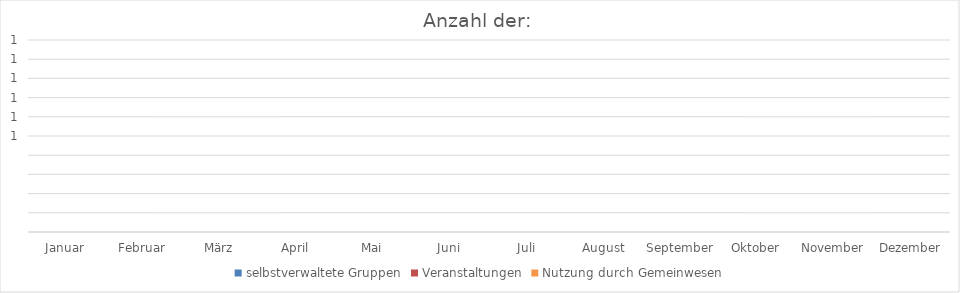
| Category | selbstverwaltete Gruppen | Veranstaltungen | Nutzung durch Gemeinwesen |
|---|---|---|---|
| Januar | 0 | 0 | 0 |
| Februar | 0 | 0 | 0 |
| März | 0 | 0 | 0 |
| April | 0 | 0 | 0 |
| Mai | 0 | 0 | 0 |
| Juni | 0 | 0 | 0 |
| Juli | 0 | 0 | 0 |
| August | 0 | 0 | 0 |
| September | 0 | 0 | 0 |
| Oktober | 0 | 0 | 0 |
| November | 0 | 0 | 0 |
| Dezember | 0 | 0 | 0 |